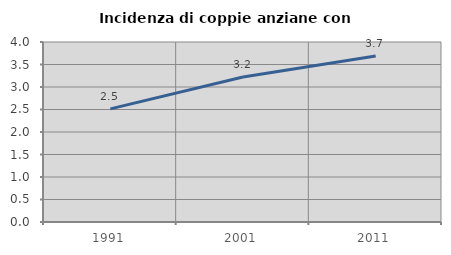
| Category | Incidenza di coppie anziane con figli |
|---|---|
| 1991.0 | 2.515 |
| 2001.0 | 3.223 |
| 2011.0 | 3.689 |